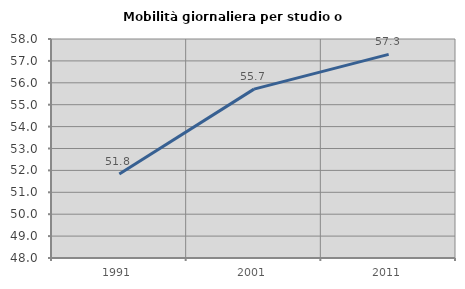
| Category | Mobilità giornaliera per studio o lavoro |
|---|---|
| 1991.0 | 51.836 |
| 2001.0 | 55.712 |
| 2011.0 | 57.298 |